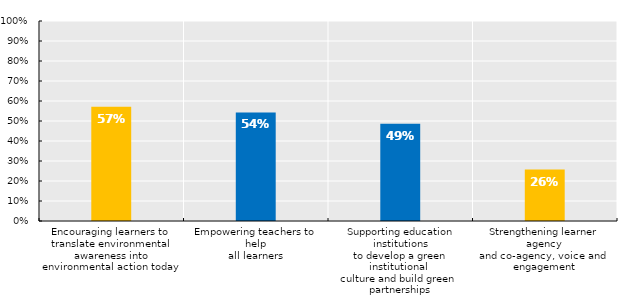
| Category | To a great extent |
|---|---|
| Encouraging learners to translate environmental awareness into environmental action today | 0.571 |
| Empowering teachers to help
all learners | 0.543 |
| Supporting education institutions
to develop a green institutional 
culture and build green 
partnerships | 0.486 |
| Strengthening learner agency
and co-agency, voice and 
engagement | 0.257 |